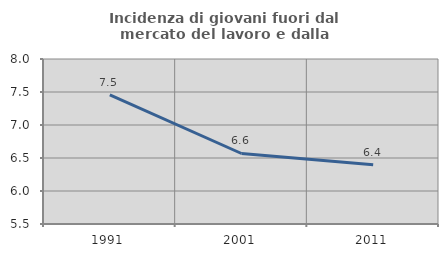
| Category | Incidenza di giovani fuori dal mercato del lavoro e dalla formazione  |
|---|---|
| 1991.0 | 7.458 |
| 2001.0 | 6.568 |
| 2011.0 | 6.397 |